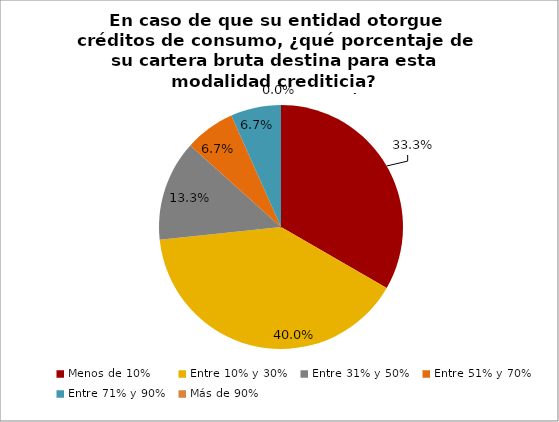
| Category | En caso de que su entidad otorgue créditos de consumo, ¿qué porcentaje de su cartera bruta destina para esta modalidad crediticia? Mercado de microcrédito |
|---|---|
| Menos de 10% | 0.333 |
| Entre 10% y 30% | 0.4 |
| Entre 31% y 50% | 0.133 |
| Entre 51% y 70% | 0.067 |
| Entre 71% y 90% | 0.067 |
| Más de 90% | 0 |